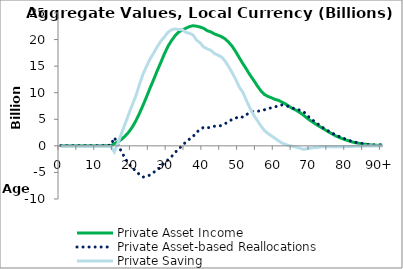
| Category | Private Asset Income | Private Asset-based Reallocations | Private Saving |
|---|---|---|---|
| 0 | -0.067 | 51.109 | -51.177 |
|  | -0.045 | 53.547 | -53.592 |
| 2 | -0.023 | 56.033 | -56.056 |
| 3 | -0.001 | 58.576 | -58.578 |
| 4 | 0.02 | 61.185 | -61.165 |
| 5 | 0.041 | 64.466 | -64.425 |
| 6 | 0 | 69.945 | -69.945 |
| 7 | 0 | 76.244 | -76.244 |
| 8 | 0 | 79.761 | -79.761 |
| 9 | 0 | 83.015 | -83.015 |
| 10 | 0 | 88.442 | -88.442 |
| 11 | 0 | 92.388 | -92.388 |
| 12 | 0 | 98.044 | -98.044 |
| 13 | 0 | 104.482 | -104.482 |
| 14 | 0 | 110.555 | -110.555 |
| 15 | 421.301 | 1568.868 | -1147.567 |
| 16 | 754.837 | 244.049 | 510.788 |
| 17 | 1223.197 | -1121.345 | 2344.542 |
| 18 | 1832.352 | -2309.399 | 4141.751 |
| 19 | 2568.01 | -3355.057 | 5923.067 |
| 20 | 3508.383 | -4171.73 | 7680.113 |
| 21 | 4680.738 | -4676.701 | 9357.44 |
| 22 | 6073.671 | -5393.084 | 11466.755 |
| 23 | 7599.752 | -5869.137 | 13468.888 |
| 24 | 9196.384 | -5759.849 | 14956.233 |
| 25 | 10881.409 | -5476.547 | 16357.956 |
| 26 | 12467.608 | -4976.067 | 17443.676 |
| 27 | 14124.82 | -4521.417 | 18646.237 |
| 28 | 15692.721 | -3995.028 | 19687.749 |
| 29 | 17290.242 | -3189.575 | 20479.817 |
| 30 | 18713.634 | -2647.442 | 21361.076 |
| 31 | 19815.049 | -2031.187 | 21846.235 |
| 32 | 20714.174 | -1283.105 | 21997.279 |
| 33 | 21398.059 | -492.324 | 21890.383 |
| 34 | 21801.925 | -46.591 | 21848.516 |
| 35 | 22115.899 | 755.397 | 21360.502 |
| 36 | 22439.306 | 1248.059 | 21191.247 |
| 37 | 22599.288 | 1701.125 | 20898.163 |
| 38 | 22521.034 | 2614.182 | 19906.852 |
| 39 | 22362.148 | 2966.413 | 19395.735 |
| 40 | 22117.806 | 3516.973 | 18600.832 |
| 41 | 21666.12 | 3414.504 | 18251.616 |
| 42 | 21451.941 | 3460.589 | 17991.352 |
| 43 | 21065.388 | 3686.781 | 17378.607 |
| 44 | 20815.768 | 3740.71 | 17075.058 |
| 45 | 20538.743 | 3814.956 | 16723.787 |
| 46 | 20144.272 | 4175.498 | 15968.775 |
| 47 | 19504.769 | 4579.771 | 14924.998 |
| 48 | 18729.304 | 4994.72 | 13734.585 |
| 49 | 17707.222 | 5224.74 | 12482.482 |
| 50 | 16558.694 | 5534.913 | 11023.781 |
| 51 | 15458.875 | 5394.168 | 10064.706 |
| 52 | 14402.539 | 5906.031 | 8496.508 |
| 53 | 13313.255 | 6236.305 | 7076.95 |
| 54 | 12354.695 | 6519.24 | 5835.455 |
| 55 | 11314.842 | 6492.8 | 4822.042 |
| 56 | 10385.168 | 6610.638 | 3774.53 |
| 57 | 9667.2 | 6775.639 | 2891.561 |
| 58 | 9306.593 | 6958.062 | 2348.531 |
| 59 | 9047.599 | 7191.999 | 1855.6 |
| 60 | 8734.21 | 7316.317 | 1417.893 |
| 61 | 8562.831 | 7636.925 | 925.905 |
| 62 | 8195.642 | 7693.591 | 502.051 |
| 63 | 7854.283 | 7605.854 | 248.428 |
| 64 | 7390.039 | 7350.325 | 39.714 |
| 65 | 6986.389 | 7089.928 | -103.539 |
| 66 | 6663.756 | 6932.899 | -269.144 |
| 67 | 6244.307 | 6685.334 | -441.028 |
| 68 | 5749 | 6410.321 | -661.32 |
| 69 | 5191.86 | 5704.778 | -512.917 |
| 70 | 4701.557 | 5129.279 | -427.722 |
| 71 | 4275.394 | 4593.121 | -317.727 |
| 72 | 3821.358 | 4119.283 | -297.925 |
| 73 | 3436.786 | 3598.37 | -161.584 |
| 74 | 3022.426 | 3162.238 | -139.813 |
| 75 | 2611.821 | 2763.835 | -152.014 |
| 76 | 2234.022 | 2384.699 | -150.677 |
| 77 | 1869.721 | 2077.592 | -207.871 |
| 78 | 1577.849 | 1745.472 | -167.623 |
| 79 | 1314.584 | 1488.29 | -173.706 |
| 80 | 1068.145 | 1198.58 | -130.434 |
| 81 | 859.049 | 965.641 | -106.592 |
| 82 | 663.945 | 762.374 | -98.428 |
| 83 | 529.3 | 599.772 | -70.472 |
| 84 | 414.395 | 477.233 | -62.838 |
| 85 | 319.493 | 371.701 | -52.208 |
| 86 | 244.865 | 266.398 | -21.533 |
| 87 | 180.294 | 218.993 | -38.699 |
| 88 | 131.9 | 164.016 | -32.115 |
| 89 | 94.548 | 120.484 | -25.936 |
| 90+ | 204.905 | 267.519 | -62.614 |